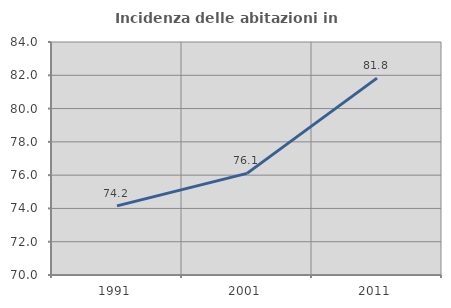
| Category | Incidenza delle abitazioni in proprietà  |
|---|---|
| 1991.0 | 74.155 |
| 2001.0 | 76.108 |
| 2011.0 | 81.83 |